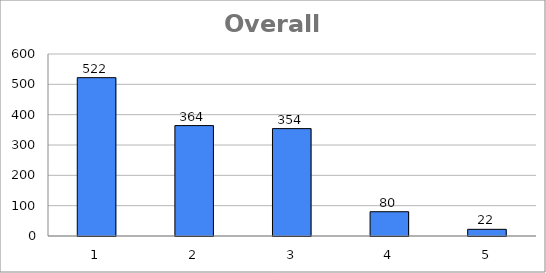
| Category | Series 0 |
|---|---|
| 0 | 522 |
| 1 | 364 |
| 2 | 354 |
| 3 | 80 |
| 4 | 22 |